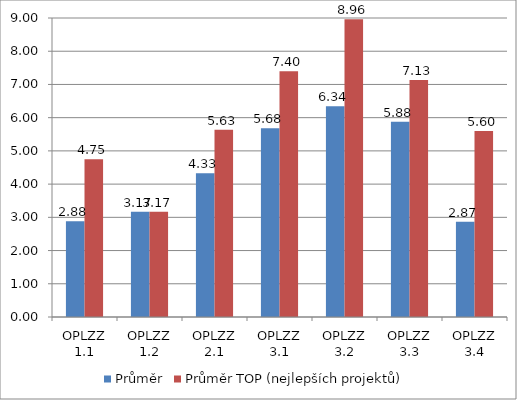
| Category | Průměr | Průměr TOP (nejlepších projektů) |
|---|---|---|
| OPLZZ 1.1 | 2.88 | 4.75 |
| OPLZZ 1.2 | 3.17 | 3.167 |
| OPLZZ 2.1 | 4.33 | 5.633 |
| OPLZZ 3.1 | 5.68 | 7.4 |
| OPLZZ 3.2 | 6.34 | 8.962 |
| OPLZZ 3.3 | 5.88 | 7.133 |
| OPLZZ 3.4 | 2.87 | 5.6 |